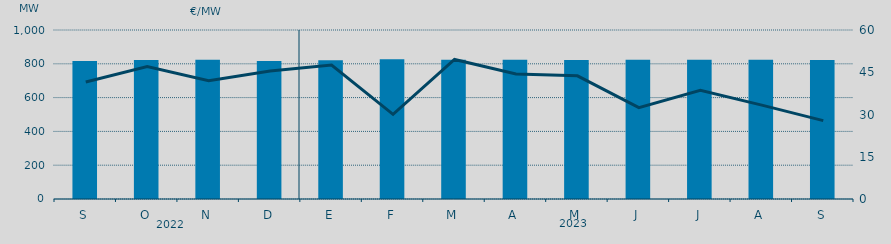
| Category | Potencia media a subir |
|---|---|
| S | 816.21 |
| O | 822.826 |
| N | 823.957 |
| D | 816.374 |
| E | 820.977 |
| F | 826.222 |
| M | 823.778 |
| A | 823.61 |
| M | 822.859 |
| J | 823.94 |
| J | 824.277 |
| A | 824.017 |
| S | 822.566 |